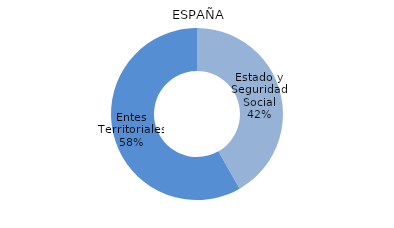
| Category | Series 0 |
|---|---|
| Estado y Seguridad Social | 2892747 |
| Entes Territoriales | 4036987 |